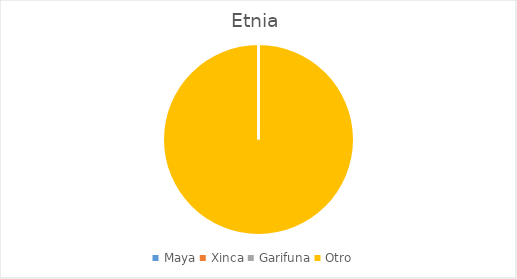
| Category | Series 0 |
|---|---|
| Maya | 0 |
| Xinca | 0 |
| Garifuna | 0 |
| Otro | 116 |